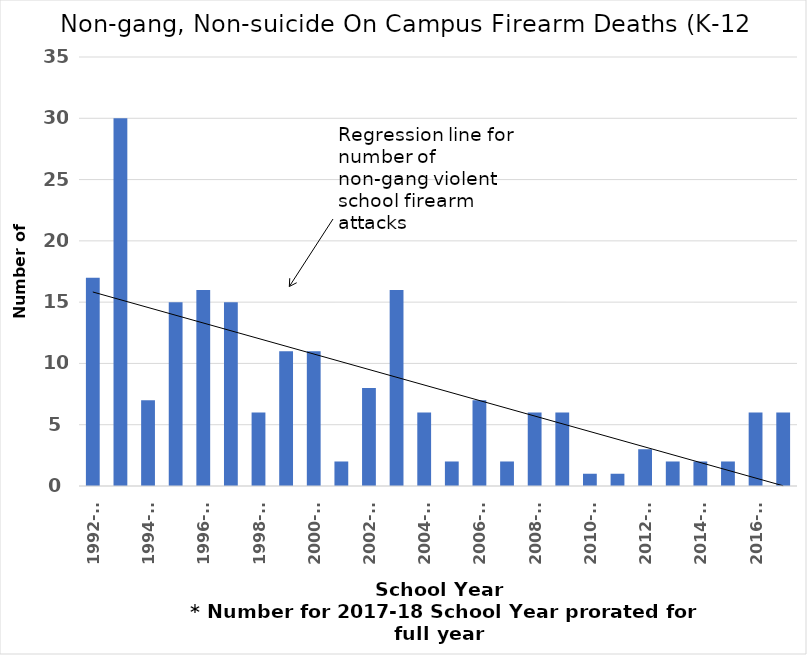
| Category | Number of Shootinng_K12 |
|---|---|
| 1992-93 | 17 |
| 1993-94 | 30 |
| 1994-95 | 7 |
| 1995-96 | 15 |
| 1996-97 | 16 |
| 1997-98 | 15 |
| 1998-99 | 6 |
| 1999-00 | 11 |
| 2000-01 | 11 |
| 2001-02 | 2 |
| 2002-03 | 8 |
| 2003-04 | 16 |
| 2004-05 | 6 |
| 2005-06 | 2 |
| 2006-07 | 7 |
| 2007-08 | 2 |
| 2008-09 | 6 |
| 2009-10 | 6 |
| 2010-11 | 1 |
| 2011-12 | 1 |
| 2012-13 | 3 |
| 2013-14 | 2 |
| 2014-15 | 2 |
| 2015-16 | 2 |
| 2016-17 | 6 |
| 2017 to Feb.14, 2018* | 6 |